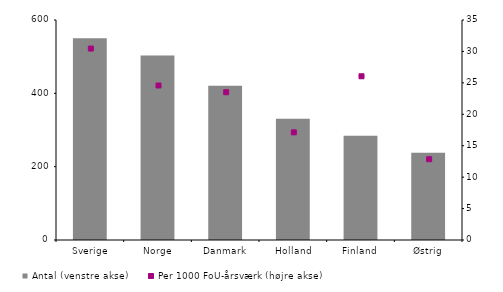
| Category | Antal (venstre akse) |
|---|---|
| Sverige | 550.25 |
| Norge | 503.5 |
| Danmark | 420.75 |
| Holland | 330.75 |
| Finland | 284.5 |
| Østrig | 238.25 |